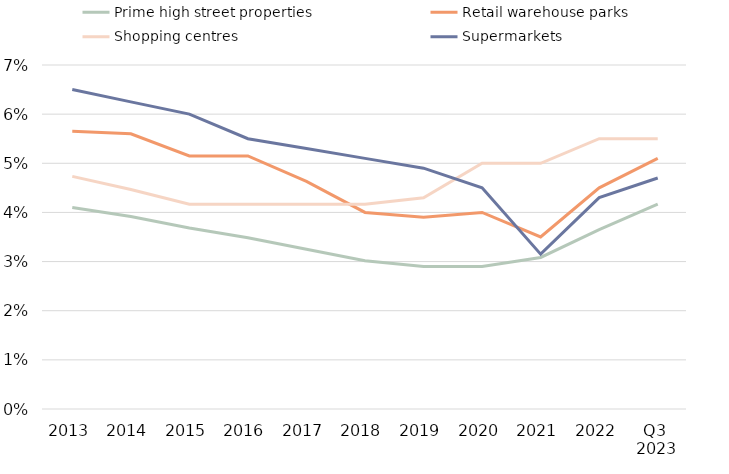
| Category | Prime high street properties | Retail warehouse parks | Shopping centres | Supermarkets |
|---|---|---|---|---|
| 2013 | 0.041 | 0.056 | 0.047 | 0.065 |
| 2014 | 0.039 | 0.056 | 0.045 | 0.062 |
| 2015 | 0.037 | 0.052 | 0.042 | 0.06 |
| 2016 | 0.035 | 0.052 | 0.042 | 0.055 |
| 2017 | 0.032 | 0.046 | 0.042 | 0.053 |
| 2018 | 0.03 | 0.04 | 0.042 | 0.051 |
| 2019 | 0.029 | 0.039 | 0.043 | 0.049 |
| 2020 | 0.029 | 0.04 | 0.05 | 0.045 |
| 2021 | 0.031 | 0.035 | 0.05 | 0.032 |
| 2022 | 0.037 | 0.045 | 0.055 | 0.043 |
| Q3 
2023 | 0.042 | 0.051 | 0.055 | 0.047 |